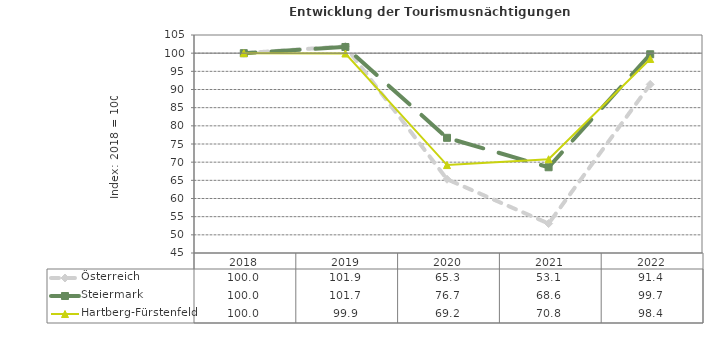
| Category | Österreich | Steiermark | Hartberg-Fürstenfeld |
|---|---|---|---|
| 2022.0 | 91.4 | 99.7 | 98.4 |
| 2021.0 | 53.1 | 68.6 | 70.8 |
| 2020.0 | 65.3 | 76.7 | 69.2 |
| 2019.0 | 101.9 | 101.7 | 99.9 |
| 2018.0 | 100 | 100 | 100 |